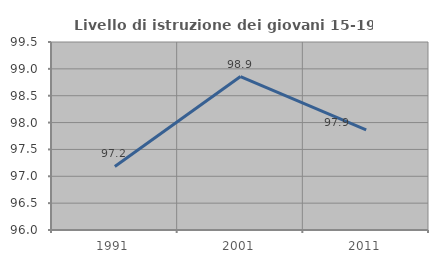
| Category | Livello di istruzione dei giovani 15-19 anni |
|---|---|
| 1991.0 | 97.183 |
| 2001.0 | 98.857 |
| 2011.0 | 97.866 |